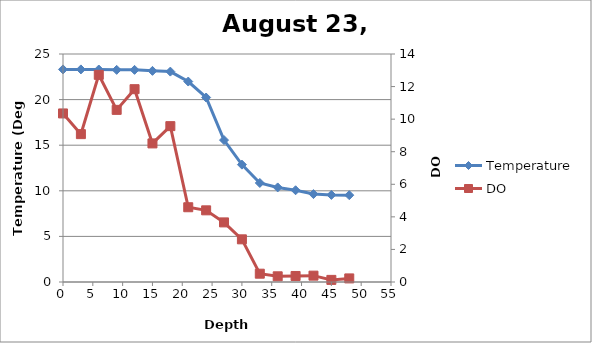
| Category | Temperature |
|---|---|
| 0.0 | 23.31 |
| 3.0 | 23.31 |
| 6.0 | 23.3 |
| 9.0 | 23.26 |
| 12.0 | 23.26 |
| 15.0 | 23.15 |
| 18.0 | 23.07 |
| 21.0 | 21.98 |
| 24.0 | 20.23 |
| 27.0 | 15.56 |
| 30.0 | 12.87 |
| 33.0 | 10.86 |
| 36.0 | 10.37 |
| 39.0 | 10.06 |
| 42.0 | 9.64 |
| 45.0 | 9.55 |
| 48.0 | 9.52 |